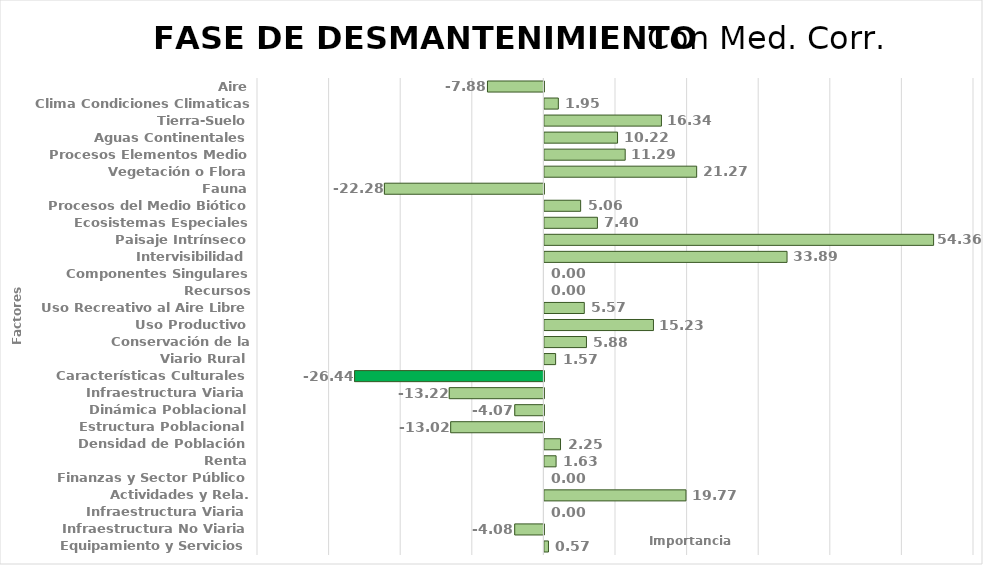
| Category | Series 0 |
|---|---|
| Aire | -7.88 |
| Clima Condiciones Climaticas | 1.946 |
| Tierra-Suelo | 16.344 |
| Aguas Continentales | 10.215 |
| Procesos Elementos Medio | 11.285 |
| Vegetación o Flora | 21.265 |
| Fauna | -22.278 |
| Procesos del Medio Biótico | 5.063 |
| Ecosistemas Especiales | 7.405 |
| Paisaje Intrínseco | 54.357 |
| Intervisibilidad | 33.888 |
| Componentes Singulares Paisaje | 0 |
| Recursos Científico-Culturales | 0 |
| Uso Recreativo al Aire Libre | 5.571 |
| Uso Productivo | 15.232 |
| Conservación de la Naturaleza | 5.875 |
| Viario Rural | 1.567 |
| Características Culturales | -26.439 |
| Infraestructura Viaria | -13.22 |
| Dinámica Poblacional | -4.068 |
| Estructura Poblacional | -13.017 |
| Densidad de Población | 2.253 |
| Renta | 1.632 |
| Finanzas y Sector Público | 0 |
| Actividades y Rela. Económicas | 19.771 |
| Infraestructura Viaria | 0 |
| Infraestructura No Viaria | -4.077 |
| Equipamiento y Servicios | 0.566 |